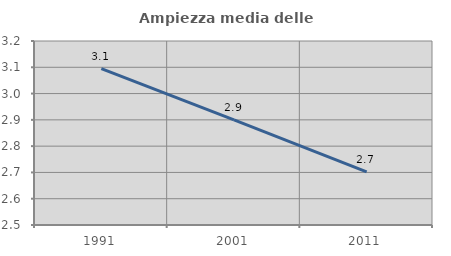
| Category | Ampiezza media delle famiglie |
|---|---|
| 1991.0 | 3.095 |
| 2001.0 | 2.9 |
| 2011.0 | 2.702 |